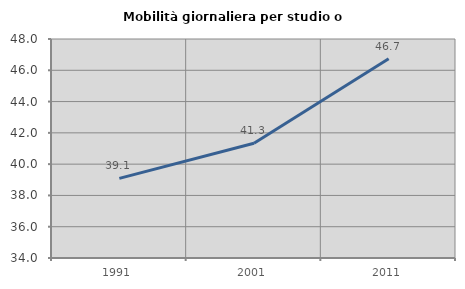
| Category | Mobilità giornaliera per studio o lavoro |
|---|---|
| 1991.0 | 39.093 |
| 2001.0 | 41.336 |
| 2011.0 | 46.742 |